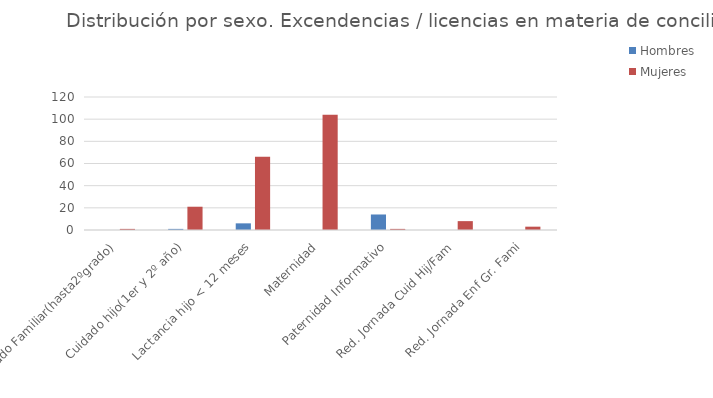
| Category | Hombres | Mujeres |
|---|---|---|
| Cuidado Familiar(hasta2ºgrado) | 0 | 1 |
| Cuidado hijo(1er y 2º año) | 1 | 21 |
| Lactancia hijo < 12 meses | 6 | 66 |
| Maternidad | 0 | 104 |
| Paternidad Informativo | 14 | 1 |
| Red. Jornada Cuid Hij/Fam | 0 | 8 |
| Red. Jornada Enf Gr. Fami | 0 | 3 |